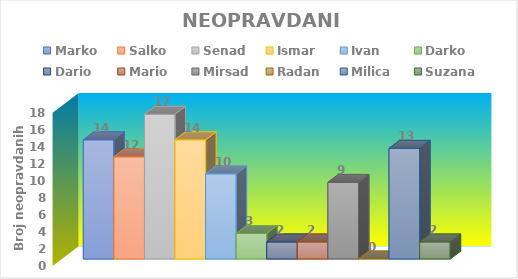
| Category | Marko | Salko | Senad | Ismar | Ivan | Darko | Dario | Mario | Mirsad | Radan | Milica | Suzana |
|---|---|---|---|---|---|---|---|---|---|---|---|---|
| NEOPRAVDANO | 14 | 12 | 17 | 14 | 10 | 3 | 2 | 2 | 9 | 0 | 13 | 2 |